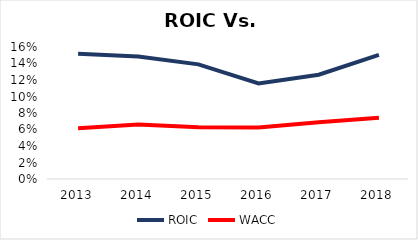
| Category | ROIC | WACC |
|---|---|---|
| 2013.0 | 0.152 | 0.062 |
| 2014.0 | 0.148 | 0.066 |
| 2015.0 | 0.139 | 0.063 |
| 2016.0 | 0.116 | 0.063 |
| 2017.0 | 0.126 | 0.069 |
| 2018.0 | 0.15 | 0.074 |